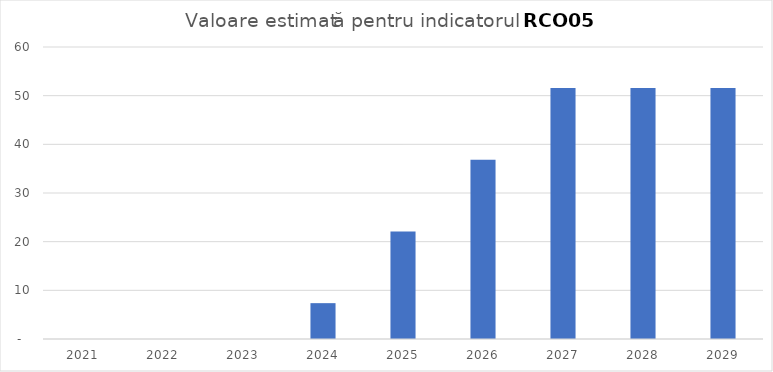
| Category | Series 0 |
|---|---|
| 2021.0 | 0 |
| 2022.0 | 0 |
| 2023.0 | 0 |
| 2024.0 | 7.366 |
| 2025.0 | 22.098 |
| 2026.0 | 36.829 |
| 2027.0 | 51.561 |
| 2028.0 | 51.561 |
| 2029.0 | 51.561 |